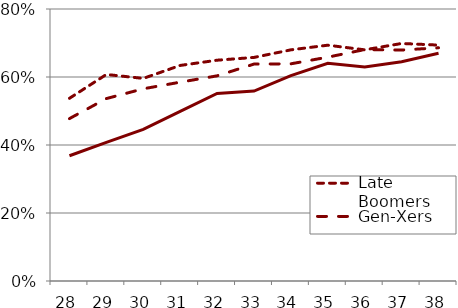
| Category | Late Boomers | Gen-Xers | Millennials |
|---|---|---|---|
| 28.0 | 0.537 | 0.478 | 0.368 |
| 29.0 | 0.607 | 0.537 | 0.408 |
| 30.0 | 0.596 | 0.565 | 0.446 |
| 31.0 | 0.634 | 0.585 | 0.499 |
| 32.0 | 0.649 | 0.603 | 0.552 |
| 33.0 | 0.658 | 0.638 | 0.559 |
| 34.0 | 0.68 | 0.639 | 0.604 |
| 35.0 | 0.694 | 0.658 | 0.64 |
| 36.0 | 0.68 | 0.681 | 0.629 |
| 37.0 | 0.699 | 0.679 | 0.645 |
| 38.0 | 0.694 | 0.686 | 0.67 |